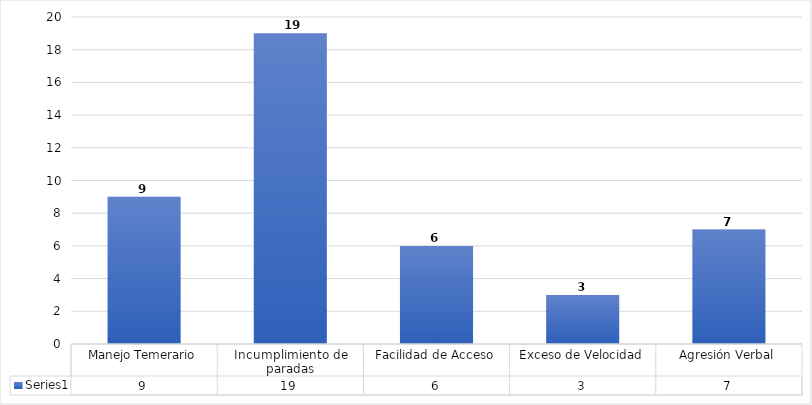
| Category | Series 0 |
|---|---|
| Manejo Temerario | 9 |
| Incumplimiento de paradas | 19 |
| Facilidad de Acceso | 6 |
| Exceso de Velocidad | 3 |
| Agresión Verbal | 7 |